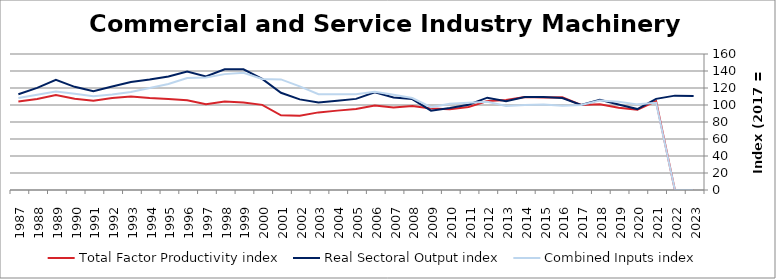
| Category | Total Factor Productivity index | Real Sectoral Output index | Combined Inputs index |
|---|---|---|---|
| 2023.0 | 0 | 110.518 | 0 |
| 2022.0 | 0 | 111.025 | 0 |
| 2021.0 | 104.482 | 107.227 | 102.627 |
| 2020.0 | 94.486 | 95.189 | 100.744 |
| 2019.0 | 96.721 | 100.548 | 103.956 |
| 2018.0 | 100.8 | 106.173 | 105.33 |
| 2017.0 | 100 | 100 | 100 |
| 2016.0 | 109.094 | 108.252 | 99.228 |
| 2015.0 | 108.785 | 109.416 | 100.58 |
| 2014.0 | 109.355 | 109.411 | 100.052 |
| 2013.0 | 105.819 | 104.502 | 98.755 |
| 2012.0 | 104.599 | 108.605 | 103.83 |
| 2011.0 | 97.557 | 100.236 | 102.745 |
| 2010.0 | 94.947 | 96.41 | 101.541 |
| 2009.0 | 95.779 | 93.338 | 97.451 |
| 2008.0 | 98.886 | 106.948 | 108.153 |
| 2007.0 | 97.028 | 108.824 | 112.158 |
| 2006.0 | 99.4 | 114.82 | 115.513 |
| 2005.0 | 95.182 | 107.189 | 112.614 |
| 2004.0 | 93.385 | 105.138 | 112.585 |
| 2003.0 | 91.308 | 102.975 | 112.777 |
| 2002.0 | 87.392 | 106.609 | 121.989 |
| 2001.0 | 87.896 | 114.346 | 130.092 |
| 2000.0 | 100.141 | 130.765 | 130.581 |
| 1999.0 | 102.849 | 141.946 | 138.014 |
| 1998.0 | 104.161 | 141.997 | 136.325 |
| 1997.0 | 100.882 | 133.529 | 132.362 |
| 1996.0 | 105.651 | 139.258 | 131.809 |
| 1995.0 | 107.084 | 133.487 | 124.656 |
| 1994.0 | 108.29 | 129.96 | 120.011 |
| 1993.0 | 110.132 | 127.048 | 115.36 |
| 1992.0 | 108.326 | 121.654 | 112.304 |
| 1991.0 | 105.12 | 116.069 | 110.415 |
| 1990.0 | 107.264 | 121.368 | 113.149 |
| 1989.0 | 111.78 | 129.627 | 115.966 |
| 1988.0 | 107.146 | 120.099 | 112.089 |
| 1987.0 | 104.219 | 112.681 | 108.119 |